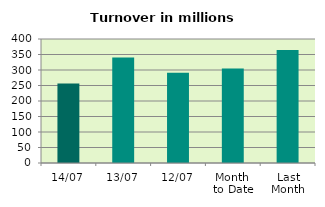
| Category | Series 0 |
|---|---|
| 14/07 | 256.262 |
| 13/07 | 340.047 |
| 12/07 | 290.996 |
| Month 
to Date | 304.85 |
| Last
Month | 364.182 |